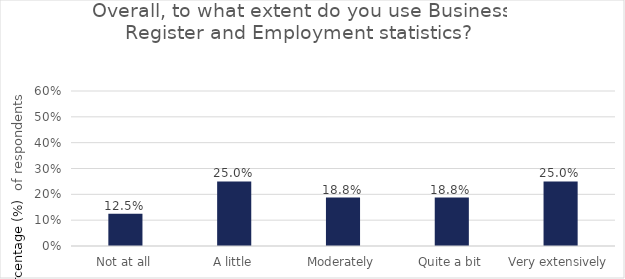
| Category | Series 0 |
|---|---|
| Not at all | 0.125 |
| A little | 0.25 |
| Moderately | 0.188 |
| Quite a bit | 0.188 |
| Very extensively | 0.25 |